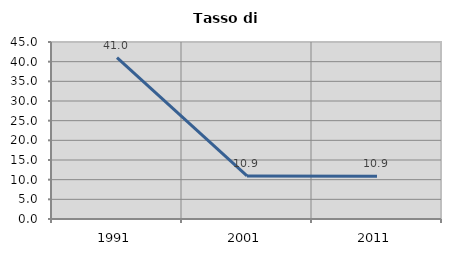
| Category | Tasso di disoccupazione   |
|---|---|
| 1991.0 | 41.031 |
| 2001.0 | 10.94 |
| 2011.0 | 10.854 |